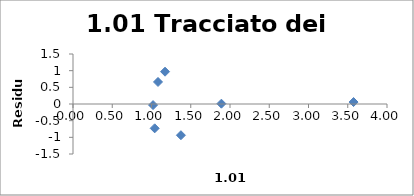
| Category | Series 0 |
|---|---|
| 1.0201 | -0.033 |
| 1.04060401 | -0.73 |
| 1.0828567056280802 | 0.661 |
| 1.1725786449236988 | 0.969 |
| 1.3749406785310976 | -0.936 |
| 1.890461869479555 | 0.01 |
| 3.573846079956134 | 0.059 |